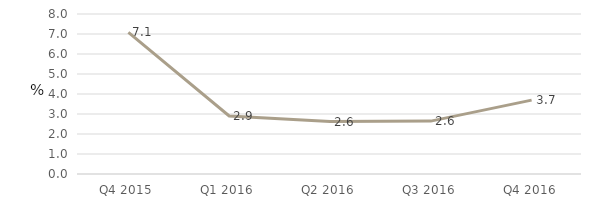
| Category | Non-Financial Corporations |
|---|---|
| Q4 2015 | 7.077 |
| Q1 2016 | 2.899 |
| Q2 2016 | 2.621 |
| Q3 2016 | 2.645 |
| Q4 2016 | 3.695 |